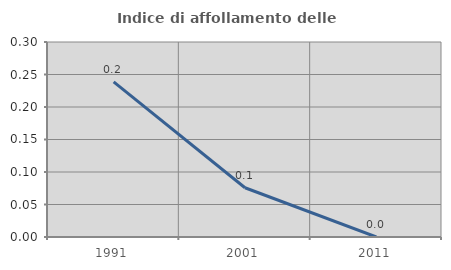
| Category | Indice di affollamento delle abitazioni  |
|---|---|
| 1991.0 | 0.239 |
| 2001.0 | 0.076 |
| 2011.0 | 0 |